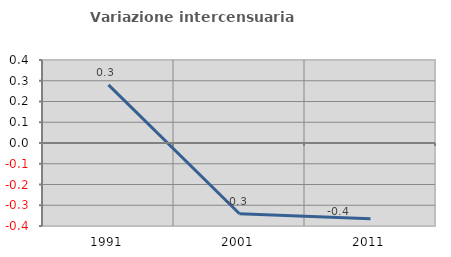
| Category | Variazione intercensuaria annua |
|---|---|
| 1991.0 | 0.28 |
| 2001.0 | -0.341 |
| 2011.0 | -0.365 |